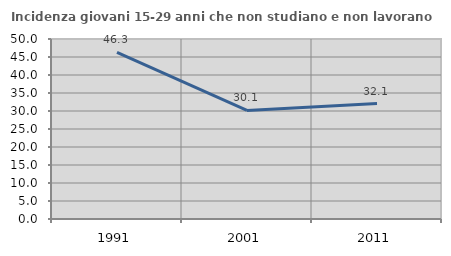
| Category | Incidenza giovani 15-29 anni che non studiano e non lavorano  |
|---|---|
| 1991.0 | 46.266 |
| 2001.0 | 30.149 |
| 2011.0 | 32.077 |